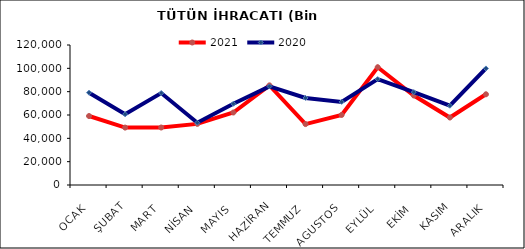
| Category | 2021 | 2020 |
|---|---|---|
| OCAK | 59118.004 | 79131.446 |
| ŞUBAT | 49199.689 | 60671.368 |
| MART | 49271.715 | 78806.018 |
| NİSAN | 52377.637 | 53409.439 |
| MAYIS | 62135.5 | 69658.718 |
| HAZİRAN | 85394.88 | 84526.764 |
| TEMMUZ | 52207.469 | 74619.318 |
| AGUSTOS | 60022.116 | 71254.858 |
| EYLÜL | 100955.429 | 90724.827 |
| EKİM | 76724.234 | 79597.038 |
| KASIM | 57833.058 | 67968.792 |
| ARALIK | 77762.28 | 99922.813 |